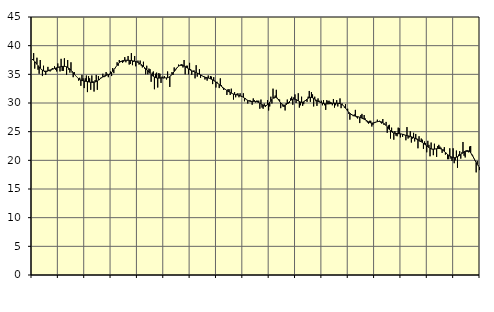
| Category | Piggar | Series 1 |
|---|---|---|
| nan | 37.5 | 37.64 |
| 87.0 | 38.7 | 37.45 |
| 87.0 | 36 | 37.22 |
| 87.0 | 37 | 36.98 |
| 87.0 | 37.9 | 36.75 |
| 87.0 | 35.8 | 36.52 |
| 87.0 | 35.1 | 36.29 |
| 87.0 | 37.5 | 36.08 |
| 87.0 | 35.8 | 35.89 |
| 87.0 | 34.7 | 35.73 |
| 87.0 | 36.5 | 35.62 |
| 87.0 | 35.4 | 35.56 |
| nan | 34.9 | 35.55 |
| 88.0 | 35.4 | 35.56 |
| 88.0 | 36.3 | 35.61 |
| 88.0 | 35.8 | 35.67 |
| 88.0 | 35.5 | 35.74 |
| 88.0 | 35.7 | 35.82 |
| 88.0 | 36.1 | 35.89 |
| 88.0 | 35.9 | 35.96 |
| 88.0 | 36.4 | 36.03 |
| 88.0 | 35.8 | 36.08 |
| 88.0 | 35.5 | 36.14 |
| 88.0 | 36.9 | 36.2 |
| nan | 36.3 | 36.25 |
| 89.0 | 35.5 | 36.3 |
| 89.0 | 37.7 | 36.34 |
| 89.0 | 35.6 | 36.37 |
| 89.0 | 35.6 | 36.39 |
| 89.0 | 37.8 | 36.39 |
| 89.0 | 36.4 | 36.37 |
| 89.0 | 34.9 | 36.31 |
| 89.0 | 37.5 | 36.21 |
| 89.0 | 35.8 | 36.09 |
| 89.0 | 35.3 | 35.93 |
| 89.0 | 37.1 | 35.73 |
| nan | 35.3 | 35.52 |
| 90.0 | 34.5 | 35.28 |
| 90.0 | 35.4 | 35.04 |
| 90.0 | 34.8 | 34.81 |
| 90.0 | 34.6 | 34.6 |
| 90.0 | 34.4 | 34.41 |
| 90.0 | 33.9 | 34.24 |
| 90.0 | 34.4 | 34.11 |
| 90.0 | 33 | 34.01 |
| 90.0 | 34.9 | 33.93 |
| 90.0 | 34.3 | 33.88 |
| 90.0 | 32.6 | 33.83 |
| nan | 34.3 | 33.79 |
| 91.0 | 34.8 | 33.76 |
| 91.0 | 31.9 | 33.73 |
| 91.0 | 34.7 | 33.69 |
| 91.0 | 34.3 | 33.65 |
| 91.0 | 32.3 | 33.61 |
| 91.0 | 34.8 | 33.59 |
| 91.0 | 33.8 | 33.59 |
| 91.0 | 32 | 33.61 |
| 91.0 | 34 | 33.66 |
| 91.0 | 34.9 | 33.74 |
| 91.0 | 32.3 | 33.85 |
| nan | 34.7 | 33.99 |
| 92.0 | 34 | 34.14 |
| 92.0 | 34.4 | 34.29 |
| 92.0 | 34.5 | 34.43 |
| 92.0 | 35.1 | 34.56 |
| 92.0 | 34.5 | 34.67 |
| 92.0 | 34.6 | 34.75 |
| 92.0 | 35.4 | 34.82 |
| 92.0 | 35.1 | 34.88 |
| 92.0 | 34.5 | 34.95 |
| 92.0 | 34.9 | 35.05 |
| 92.0 | 35.5 | 35.17 |
| nan | 34.7 | 35.35 |
| 93.0 | 36.1 | 35.55 |
| 93.0 | 35.2 | 35.8 |
| 93.0 | 36 | 36.06 |
| 93.0 | 36.3 | 36.32 |
| 93.0 | 37.1 | 36.58 |
| 93.0 | 36.5 | 36.82 |
| 93.0 | 37.5 | 37.02 |
| 93.0 | 37.3 | 37.18 |
| 93.0 | 37.2 | 37.3 |
| 93.0 | 37 | 37.38 |
| 93.0 | 37.2 | 37.42 |
| nan | 38 | 37.45 |
| 94.0 | 37.1 | 37.46 |
| 94.0 | 37.5 | 37.46 |
| 94.0 | 38.2 | 37.45 |
| 94.0 | 36.7 | 37.44 |
| 94.0 | 36.8 | 37.42 |
| 94.0 | 38.7 | 37.4 |
| 94.0 | 36.6 | 37.36 |
| 94.0 | 37.2 | 37.33 |
| 94.0 | 38.2 | 37.28 |
| 94.0 | 36.4 | 37.23 |
| 94.0 | 37.2 | 37.17 |
| nan | 37.4 | 37.08 |
| 95.0 | 36.7 | 36.97 |
| 95.0 | 37.4 | 36.85 |
| 95.0 | 36.5 | 36.7 |
| 95.0 | 36.2 | 36.54 |
| 95.0 | 37.2 | 36.37 |
| 95.0 | 36 | 36.19 |
| 95.0 | 35 | 36 |
| 95.0 | 36.5 | 35.8 |
| 95.0 | 35 | 35.59 |
| 95.0 | 36 | 35.38 |
| 95.0 | 35.9 | 35.17 |
| nan | 33.7 | 34.98 |
| 96.0 | 35.3 | 34.81 |
| 96.0 | 35.5 | 34.66 |
| 96.0 | 32.4 | 34.54 |
| 96.0 | 35.1 | 34.44 |
| 96.0 | 35.3 | 34.37 |
| 96.0 | 32.7 | 34.34 |
| 96.0 | 35.2 | 34.34 |
| 96.0 | 35.1 | 34.36 |
| 96.0 | 33.5 | 34.38 |
| 96.0 | 34.6 | 34.4 |
| 96.0 | 34.3 | 34.39 |
| nan | 34.7 | 34.38 |
| 97.0 | 34.4 | 34.38 |
| 97.0 | 34.1 | 34.38 |
| 97.0 | 35.5 | 34.41 |
| 97.0 | 34.5 | 34.49 |
| 97.0 | 32.8 | 34.6 |
| 97.0 | 34.7 | 34.76 |
| 97.0 | 35.4 | 34.97 |
| 97.0 | 34.9 | 35.21 |
| 97.0 | 36.2 | 35.49 |
| 97.0 | 35.7 | 35.77 |
| 97.0 | 35.9 | 36.03 |
| nan | 36.2 | 36.26 |
| 98.0 | 36.7 | 36.42 |
| 98.0 | 36.5 | 36.53 |
| 98.0 | 36.7 | 36.57 |
| 98.0 | 36.8 | 36.56 |
| 98.0 | 36.2 | 36.52 |
| 98.0 | 37.5 | 36.44 |
| 98.0 | 35 | 36.34 |
| 98.0 | 36.5 | 36.22 |
| 98.0 | 36.5 | 36.09 |
| 98.0 | 35 | 35.95 |
| 98.0 | 37 | 35.83 |
| nan | 35.9 | 35.72 |
| 99.0 | 34.9 | 35.62 |
| 99.0 | 35.5 | 35.54 |
| 99.0 | 35.7 | 35.46 |
| 99.0 | 34.3 | 35.39 |
| 99.0 | 36.6 | 35.31 |
| 99.0 | 34.6 | 35.22 |
| 99.0 | 35.1 | 35.13 |
| 99.0 | 35.9 | 35.02 |
| 99.0 | 34.4 | 34.91 |
| 99.0 | 34.9 | 34.79 |
| 99.0 | 34.7 | 34.68 |
| nan | 34.7 | 34.58 |
| 0.0 | 34.1 | 34.5 |
| 0.0 | 34.3 | 34.44 |
| 0.0 | 33.9 | 34.4 |
| 0.0 | 34.8 | 34.35 |
| 0.0 | 34.3 | 34.3 |
| 0.0 | 34.7 | 34.23 |
| 0.0 | 34.6 | 34.14 |
| 0.0 | 33.3 | 34.04 |
| 0.0 | 34.5 | 33.92 |
| 0.0 | 33.9 | 33.8 |
| 0.0 | 32.7 | 33.66 |
| nan | 33.7 | 33.52 |
| 1.0 | 33.4 | 33.37 |
| 1.0 | 32.6 | 33.22 |
| 1.0 | 34.3 | 33.06 |
| 1.0 | 33.1 | 32.91 |
| 1.0 | 32.6 | 32.76 |
| 1.0 | 32.3 | 32.61 |
| 1.0 | 32.4 | 32.46 |
| 1.0 | 32.3 | 32.31 |
| 1.0 | 31.4 | 32.17 |
| 1.0 | 32.4 | 32.04 |
| 1.0 | 32.4 | 31.92 |
| nan | 31.4 | 31.82 |
| 2.0 | 32.5 | 31.72 |
| 2.0 | 31.6 | 31.64 |
| 2.0 | 30.6 | 31.57 |
| 2.0 | 31.9 | 31.51 |
| 2.0 | 31 | 31.46 |
| 2.0 | 31.6 | 31.42 |
| 2.0 | 31.7 | 31.38 |
| 2.0 | 31 | 31.34 |
| 2.0 | 31.7 | 31.29 |
| 2.0 | 31.1 | 31.22 |
| 2.0 | 31.1 | 31.11 |
| nan | 31.7 | 30.99 |
| 3.0 | 30.3 | 30.84 |
| 3.0 | 30.8 | 30.69 |
| 3.0 | 30.6 | 30.56 |
| 3.0 | 29.9 | 30.45 |
| 3.0 | 30.4 | 30.36 |
| 3.0 | 30.5 | 30.31 |
| 3.0 | 30.2 | 30.28 |
| 3.0 | 29.7 | 30.28 |
| 3.0 | 30.8 | 30.28 |
| 3.0 | 30.5 | 30.28 |
| 3.0 | 30.1 | 30.26 |
| nan | 30.4 | 30.23 |
| 4.0 | 30.4 | 30.16 |
| 4.0 | 30.4 | 30.08 |
| 4.0 | 29 | 29.97 |
| 4.0 | 30.6 | 29.85 |
| 4.0 | 29.2 | 29.72 |
| 4.0 | 29 | 29.62 |
| 4.0 | 29.9 | 29.55 |
| 4.0 | 29.3 | 29.54 |
| 4.0 | 29.5 | 29.6 |
| 4.0 | 30.5 | 29.72 |
| 4.0 | 28.7 | 29.9 |
| nan | 29.4 | 30.13 |
| 5.0 | 31.1 | 30.38 |
| 5.0 | 29.9 | 30.63 |
| 5.0 | 32.5 | 30.83 |
| 5.0 | 30.8 | 30.97 |
| 5.0 | 31.3 | 31 |
| 5.0 | 32.3 | 30.93 |
| 5.0 | 30.9 | 30.78 |
| 5.0 | 30.7 | 30.55 |
| 5.0 | 30.6 | 30.28 |
| 5.0 | 29.1 | 30.02 |
| 5.0 | 29.9 | 29.81 |
| nan | 29.4 | 29.67 |
| 6.0 | 29.3 | 29.61 |
| 6.0 | 28.7 | 29.63 |
| 6.0 | 30 | 29.72 |
| 6.0 | 30.6 | 29.87 |
| 6.0 | 29.9 | 30.06 |
| 6.0 | 30 | 30.26 |
| 6.0 | 30.8 | 30.44 |
| 6.0 | 31.1 | 30.57 |
| 6.0 | 29.7 | 30.66 |
| 6.0 | 31 | 30.69 |
| 6.0 | 31.5 | 30.66 |
| nan | 30 | 30.6 |
| 7.0 | 30.4 | 30.49 |
| 7.0 | 31.7 | 30.37 |
| 7.0 | 29.2 | 30.26 |
| 7.0 | 29.6 | 30.17 |
| 7.0 | 31.1 | 30.12 |
| 7.0 | 29.5 | 30.14 |
| 7.0 | 29.8 | 30.21 |
| 7.0 | 30.4 | 30.34 |
| 7.0 | 30.4 | 30.51 |
| 7.0 | 30.2 | 30.68 |
| 7.0 | 31.1 | 30.83 |
| nan | 32.1 | 30.93 |
| 8.0 | 30.2 | 30.98 |
| 8.0 | 31.9 | 30.97 |
| 8.0 | 31.5 | 30.9 |
| 8.0 | 29.4 | 30.8 |
| 8.0 | 31.1 | 30.68 |
| 8.0 | 30.3 | 30.54 |
| 8.0 | 29.5 | 30.41 |
| 8.0 | 30.8 | 30.29 |
| 8.0 | 30.4 | 30.19 |
| 8.0 | 30.1 | 30.11 |
| 8.0 | 30.4 | 30.03 |
| nan | 29.6 | 29.97 |
| 9.0 | 30.5 | 29.92 |
| 9.0 | 29.6 | 29.88 |
| 9.0 | 28.8 | 29.85 |
| 9.0 | 30.5 | 29.84 |
| 9.0 | 30.3 | 29.84 |
| 9.0 | 30.4 | 29.86 |
| 9.0 | 30.2 | 29.88 |
| 9.0 | 30.1 | 29.91 |
| 9.0 | 29.6 | 29.94 |
| 9.0 | 30.7 | 29.96 |
| 9.0 | 29.2 | 29.97 |
| nan | 29.6 | 29.97 |
| 10.0 | 30.5 | 29.96 |
| 10.0 | 29.4 | 29.95 |
| 10.0 | 30 | 29.93 |
| 10.0 | 30.8 | 29.9 |
| 10.0 | 29.1 | 29.83 |
| 10.0 | 29.9 | 29.72 |
| 10.0 | 29.5 | 29.55 |
| 10.0 | 29.2 | 29.34 |
| 10.0 | 29.8 | 29.1 |
| 10.0 | 28.8 | 28.84 |
| 10.0 | 29 | 28.6 |
| nan | 28.1 | 28.39 |
| 11.0 | 27.1 | 28.2 |
| 11.0 | 28 | 28.05 |
| 11.0 | 27.9 | 27.93 |
| 11.0 | 27.7 | 27.83 |
| 11.0 | 28 | 27.76 |
| 11.0 | 28.8 | 27.7 |
| 11.0 | 27.5 | 27.66 |
| 11.0 | 27.3 | 27.62 |
| 11.0 | 27.6 | 27.57 |
| 11.0 | 26.5 | 27.51 |
| 11.0 | 27.9 | 27.43 |
| nan | 28.1 | 27.36 |
| 12.0 | 27.2 | 27.27 |
| 12.0 | 27.9 | 27.18 |
| 12.0 | 27.3 | 27.08 |
| 12.0 | 26.8 | 26.96 |
| 12.0 | 26.6 | 26.84 |
| 12.0 | 26.4 | 26.71 |
| 12.0 | 26.9 | 26.61 |
| 12.0 | 26.9 | 26.53 |
| 12.0 | 25.9 | 26.5 |
| 12.0 | 26.2 | 26.51 |
| 12.0 | 26.5 | 26.55 |
| nan | 26.7 | 26.61 |
| 13.0 | 26.7 | 26.68 |
| 13.0 | 27.1 | 26.74 |
| 13.0 | 26.7 | 26.77 |
| 13.0 | 26.9 | 26.78 |
| 13.0 | 26.6 | 26.75 |
| 13.0 | 26.4 | 26.69 |
| 13.0 | 27.2 | 26.58 |
| 13.0 | 26.2 | 26.44 |
| 13.0 | 26.2 | 26.26 |
| 13.0 | 26.7 | 26.06 |
| 13.0 | 24.8 | 25.83 |
| nan | 26.1 | 25.59 |
| 14.0 | 26.2 | 25.36 |
| 14.0 | 23.8 | 25.16 |
| 14.0 | 25.7 | 24.99 |
| 14.0 | 25.1 | 24.86 |
| 14.0 | 23.6 | 24.77 |
| 14.0 | 25.1 | 24.72 |
| 14.0 | 24.3 | 24.69 |
| 14.0 | 24.2 | 24.67 |
| 14.0 | 25.7 | 24.66 |
| 14.0 | 25.6 | 24.64 |
| 14.0 | 24 | 24.62 |
| nan | 24.6 | 24.59 |
| 15.0 | 24.1 | 24.54 |
| 15.0 | 24.6 | 24.48 |
| 15.0 | 24.4 | 24.42 |
| 15.0 | 23.5 | 24.36 |
| 15.0 | 25.8 | 24.31 |
| 15.0 | 23.8 | 24.27 |
| 15.0 | 24 | 24.23 |
| 15.0 | 25.1 | 24.18 |
| 15.0 | 23.1 | 24.11 |
| 15.0 | 23.8 | 24.03 |
| 15.0 | 24.8 | 23.95 |
| nan | 23.3 | 23.86 |
| 16.0 | 24.6 | 23.77 |
| 16.0 | 23.8 | 23.68 |
| 16.0 | 22.1 | 23.58 |
| 16.0 | 24.2 | 23.48 |
| 16.0 | 23.2 | 23.37 |
| 16.0 | 23.8 | 23.25 |
| 16.0 | 23.6 | 23.11 |
| 16.0 | 22 | 22.97 |
| 16.0 | 23.3 | 22.82 |
| 16.0 | 23 | 22.68 |
| 16.0 | 21.4 | 22.53 |
| nan | 23.4 | 22.38 |
| 17.0 | 22.7 | 22.23 |
| 17.0 | 20.7 | 22.11 |
| 17.0 | 23.1 | 22.02 |
| 17.0 | 21.9 | 21.97 |
| 17.0 | 20.9 | 21.95 |
| 17.0 | 22.9 | 21.95 |
| 17.0 | 22 | 21.98 |
| 17.0 | 20.6 | 22.02 |
| 17.0 | 22.5 | 22.06 |
| 17.0 | 22.7 | 22.07 |
| 17.0 | 22.4 | 22.05 |
| nan | 22.2 | 21.99 |
| 18.0 | 21.3 | 21.87 |
| 18.0 | 21.9 | 21.73 |
| 18.0 | 22.3 | 21.55 |
| 18.0 | 21 | 21.37 |
| 18.0 | 21.3 | 21.19 |
| 18.0 | 20.2 | 21.02 |
| 18.0 | 20.2 | 20.87 |
| 18.0 | 22.1 | 20.74 |
| 18.0 | 20.3 | 20.63 |
| 18.0 | 19.9 | 20.54 |
| 18.0 | 22.1 | 20.48 |
| nan | 19.5 | 20.46 |
| 19.0 | 20 | 20.48 |
| 19.0 | 21.7 | 20.55 |
| 19.0 | 18.7 | 20.64 |
| 19.0 | 21 | 20.74 |
| 19.0 | 21.6 | 20.87 |
| 19.0 | 20.3 | 21.01 |
| 19.0 | 21.4 | 21.17 |
| 19.0 | 23.2 | 21.33 |
| 19.0 | 20.8 | 21.48 |
| 19.0 | 20.5 | 21.6 |
| 19.0 | 21.5 | 21.68 |
| nan | 21.5 | 21.7 |
| 20.0 | 21.4 | 21.65 |
| 20.0 | 22.4 | 21.52 |
| 20.0 | 22.5 | 21.31 |
| 20.0 | 20.9 | 21.04 |
| 20.0 | 20.8 | 20.71 |
| 20.0 | 20.3 | 20.35 |
| 20.0 | 19.9 | 19.97 |
| 20.0 | 17.9 | 19.6 |
| 20.0 | 19.9 | 19.28 |
| 20.0 | 19 | 19.03 |
| 20.0 | 18.3 | 18.85 |